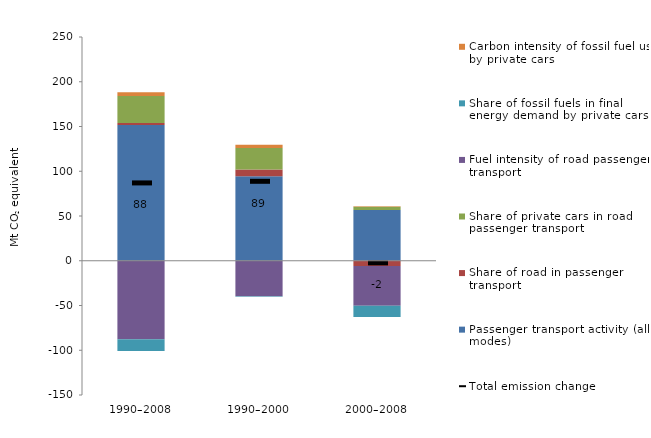
| Category | Passenger transport activity (all modes) | Share of road in passenger transport | Share of private cars in road passenger transport | Fuel intensity of road passenger transport | Share of fossil fuels in final energy demand by private cars | Carbon intensity of fossil fuel use by private cars |
|---|---|---|---|---|---|---|
| 1990–2008 | 151.671 | 2.138 | 30.366 | -87.831 | -12.962 | 4.13 |
| 1990–2000 | 94.547 | 7.35 | 24.051 | -39.611 | -0.577 | 3.566 |
| 2000–2008 | 56.57 | -5.854 | 3.769 | -44.421 | -12.458 | 0.58 |